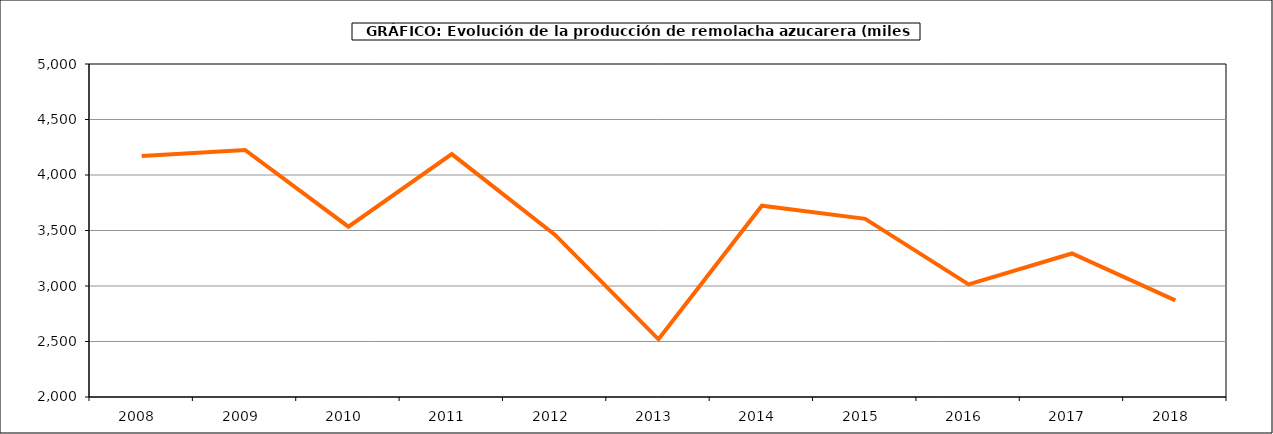
| Category | Producción |
|---|---|
| 2008.0 | 4170.442 |
| 2009.0 | 4225.433 |
| 2010.0 | 3534.517 |
| 2011.0 | 4188.535 |
| 2012.0 | 3460.23 |
| 2013.0 | 2519.482 |
| 2014.0 | 3723.309 |
| 2015.0 | 3605.112 |
| 2016.0 | 3014.358 |
| 2017.0 | 3292.75 |
| 2018.0 | 2870.907 |